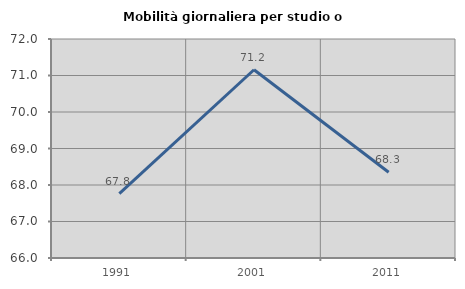
| Category | Mobilità giornaliera per studio o lavoro |
|---|---|
| 1991.0 | 67.765 |
| 2001.0 | 71.158 |
| 2011.0 | 68.35 |